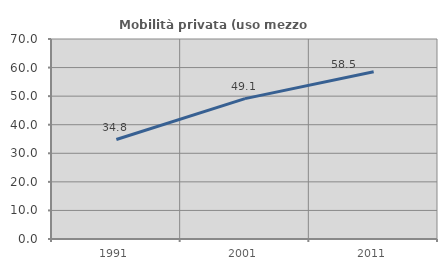
| Category | Mobilità privata (uso mezzo privato) |
|---|---|
| 1991.0 | 34.816 |
| 2001.0 | 49.127 |
| 2011.0 | 58.511 |